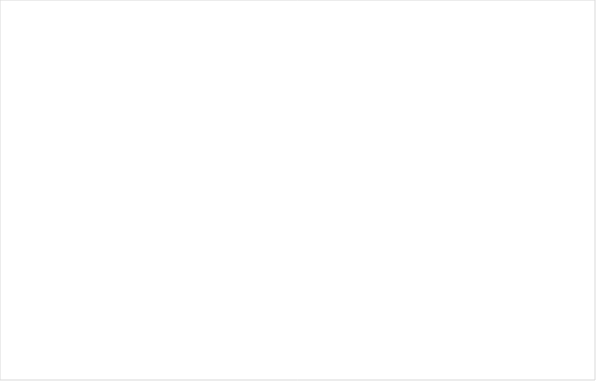
| Category | Ingen brist | Föreläggande | Föreläggande vid vite | Anmärkning |
|---|---|---|---|---|
| Enskild en enhet | 0.769 | 0.154 | 0.077 | 0 |
| Enskild flera enhet | 0.851 | 0.135 | 0.014 | 0 |
| Offentlig | 0.741 | 0.2 | 0.056 | 0.002 |